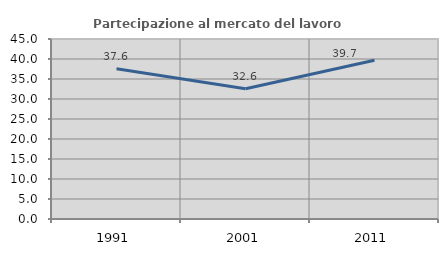
| Category | Partecipazione al mercato del lavoro  femminile |
|---|---|
| 1991.0 | 37.559 |
| 2001.0 | 32.558 |
| 2011.0 | 39.691 |